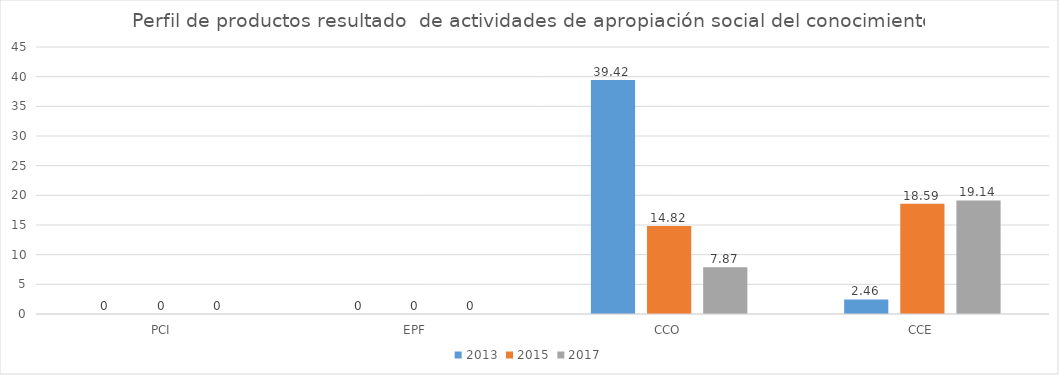
| Category | 2013 | 2015 | 2017 |
|---|---|---|---|
| PCI | 0 | 0 | 0 |
| EPF | 0 | 0 | 0 |
| CCO | 39.42 | 14.82 | 7.87 |
| CCE | 2.46 | 18.59 | 19.14 |